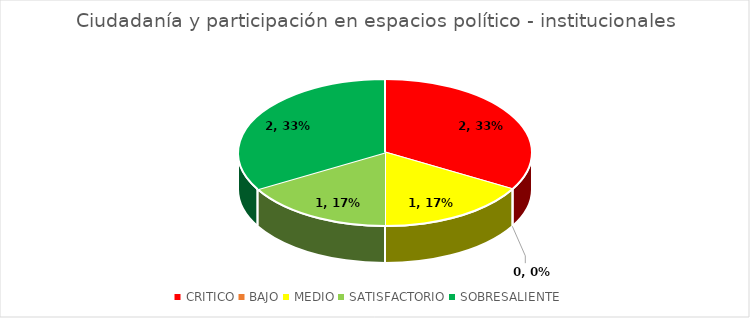
| Category | Ciudadanía y participación en espacios político - institucionales |
|---|---|
| CRITICO | 2 |
| BAJO | 0 |
| MEDIO | 1 |
| SATISFACTORIO | 1 |
| SOBRESALIENTE | 2 |